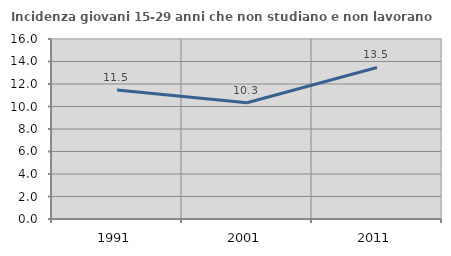
| Category | Incidenza giovani 15-29 anni che non studiano e non lavorano  |
|---|---|
| 1991.0 | 11.465 |
| 2001.0 | 10.333 |
| 2011.0 | 13.472 |